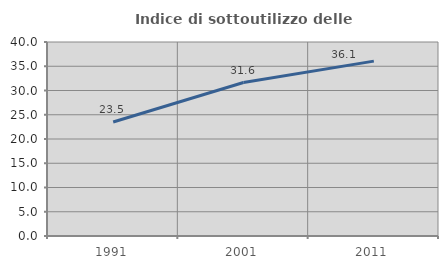
| Category | Indice di sottoutilizzo delle abitazioni  |
|---|---|
| 1991.0 | 23.497 |
| 2001.0 | 31.647 |
| 2011.0 | 36.053 |